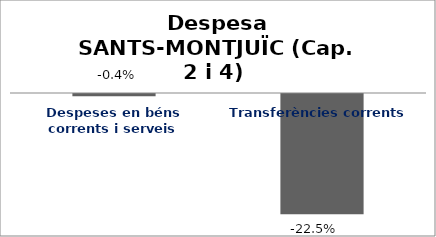
| Category | Series 0 |
|---|---|
| Despeses en béns corrents i serveis | -0.004 |
| Transferències corrents | -0.225 |